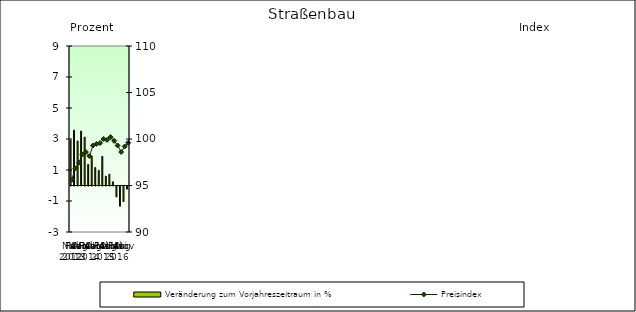
| Category | Veränderung zum Vorjahreszeitraum in % |
|---|---|
| 0 | 2.93 |
| 1 | 3.568 |
| 2 | 2.873 |
| 3 | 3.512 |
| 4 | 3.122 |
| 5 | 1.36 |
| 6 | 1.892 |
| 7 | 1.161 |
| 8 | 0.98 |
| 9 | 1.878 |
| 10 | 0.607 |
| 11 | 0.731 |
| 12 | 0.24 |
| 13 | -0.7 |
| 14 | -1.3 |
| 15 | -1 |
| 16 | -0.2 |